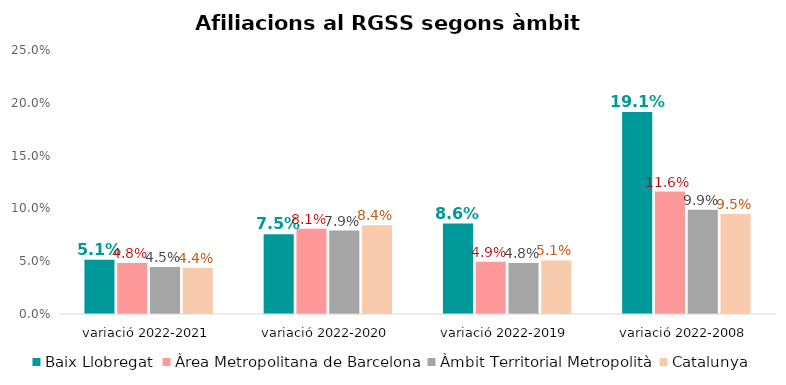
| Category | Baix Llobregat | Àrea Metropolitana de Barcelona | Àmbit Territorial Metropolità | Catalunya |
|---|---|---|---|---|
| variació 2022-2021 | 0.051 | 0.048 | 0.045 | 0.044 |
| variació 2022-2020 | 0.075 | 0.081 | 0.079 | 0.084 |
| variació 2022-2019 | 0.086 | 0.049 | 0.048 | 0.051 |
| variació 2022-2008 | 0.191 | 0.116 | 0.099 | 0.095 |